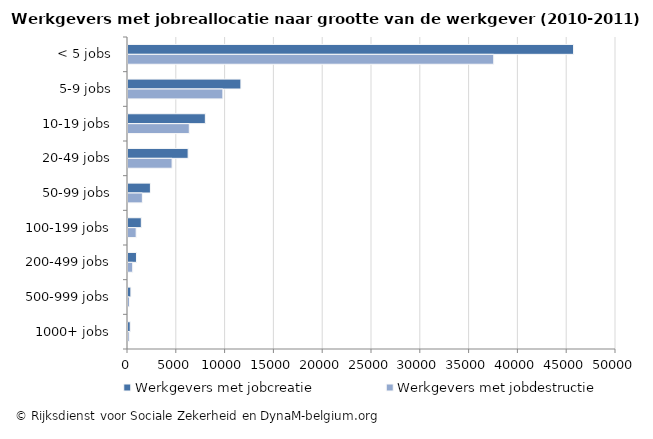
| Category | Werkgevers met jobcreatie | Werkgevers met jobdestructie |
|---|---|---|
| < 5 jobs | 45655 | 37474 |
| 5-9 jobs | 11568 | 9720 |
| 10-19 jobs | 7925 | 6279 |
| 20-49 jobs | 6161 | 4517 |
| 50-99 jobs | 2297 | 1472 |
| 100-199 jobs | 1365 | 836 |
| 200-499 jobs | 869 | 483 |
| 500-999 jobs | 295 | 149 |
| 1000+ jobs | 229 | 124 |